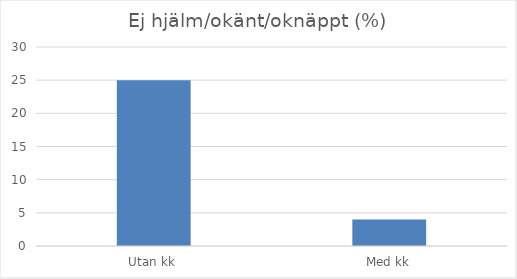
| Category | Series 0 |
|---|---|
| Utan kk | 25 |
| Med kk | 4 |